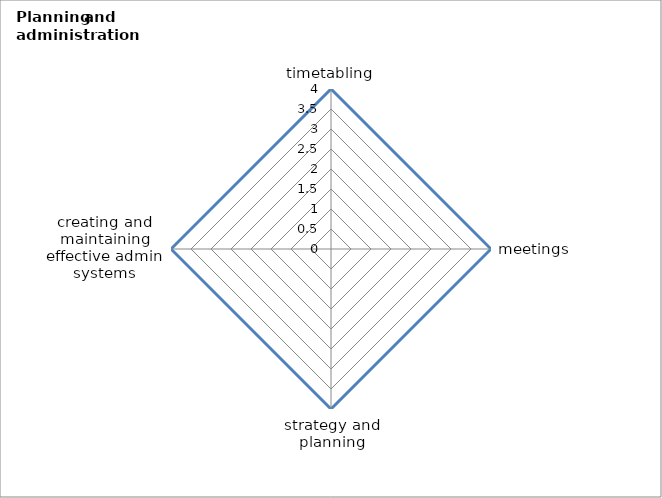
| Category | Series 0 | Series 1 |
|---|---|---|
| timetabling | 4 |  |
| meetings | 4 |  |
| strategy and planning | 4 |  |
| creating and maintaining effective admin systems | 4 |  |